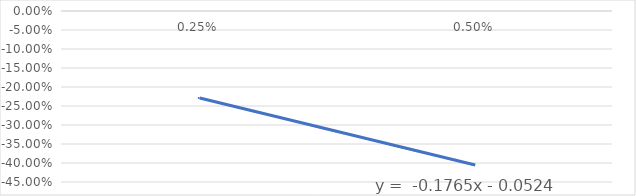
| Category | Series 0 |
|---|---|
| 0.0025 | -0.229 |
| 0.005 | -0.405 |